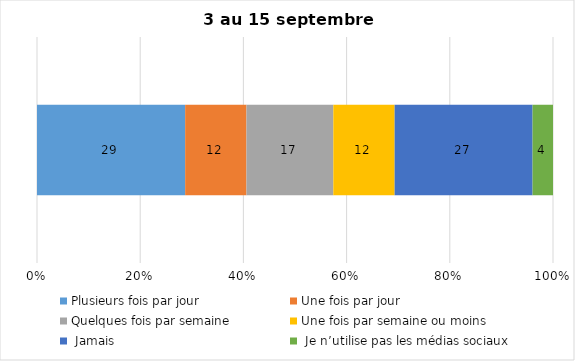
| Category | Plusieurs fois par jour | Une fois par jour | Quelques fois par semaine   | Une fois par semaine ou moins   |  Jamais   |  Je n’utilise pas les médias sociaux |
|---|---|---|---|---|---|---|
| 0 | 29 | 12 | 17 | 12 | 27 | 4 |